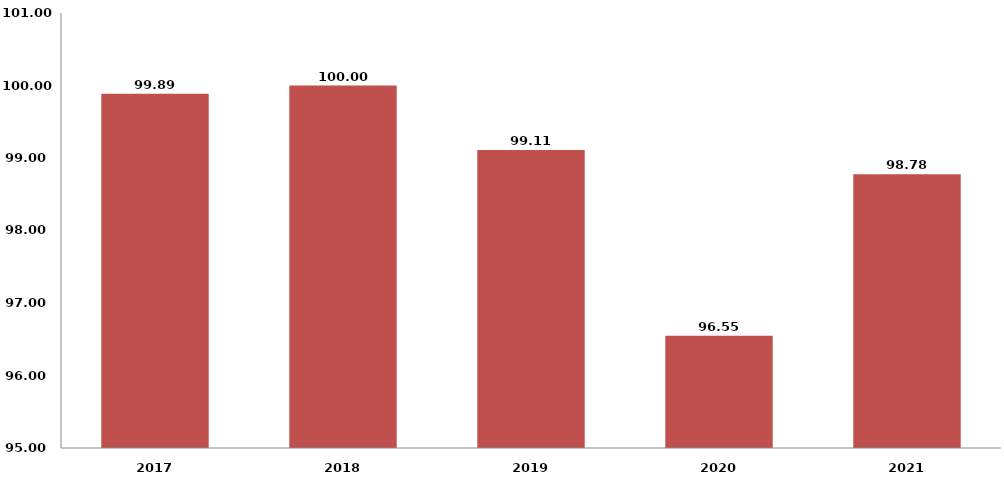
| Category | الرقم القياسي العام لأسعار المستهلك
2017 - 2021 |
|---|---|
| 2017.0 | 99.888 |
| 2018.0 | 100 |
| 2019.0 | 99.109 |
| 2020.0 | 96.549 |
| 2021.0 | 98.777 |